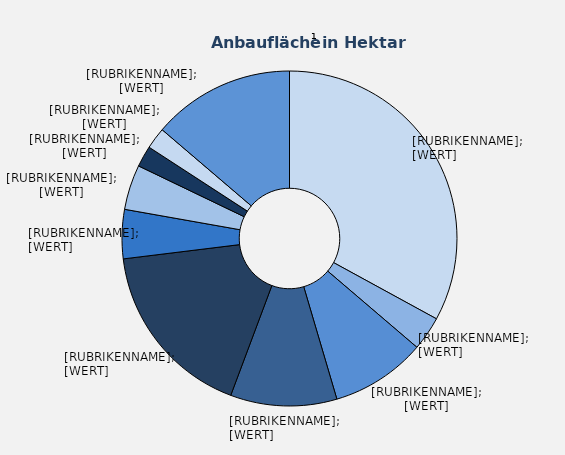
| Category | Series 1 |
|---|---|
| Elstar | 447.82 |
| Jonagold | 44.66 |
| Jonagored | 124.81 |
| Braeburn | 139.53 |
| Jonaprince | 235.72 |
| Boskoop | 64.35 |
| Holsteiner Cox | 58.98 |
| Topaz | 27.74 |
| Wellant | 28.2 |
| Sonstige | 186.8 |